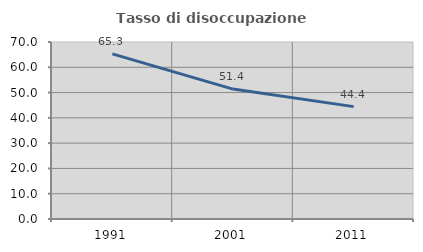
| Category | Tasso di disoccupazione giovanile  |
|---|---|
| 1991.0 | 65.306 |
| 2001.0 | 51.376 |
| 2011.0 | 44.444 |